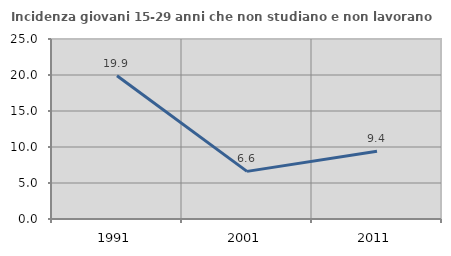
| Category | Incidenza giovani 15-29 anni che non studiano e non lavorano  |
|---|---|
| 1991.0 | 19.886 |
| 2001.0 | 6.615 |
| 2011.0 | 9.412 |